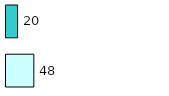
| Category | Series 0 | Series 1 |
|---|---|---|
| 0 | 48 | 20 |